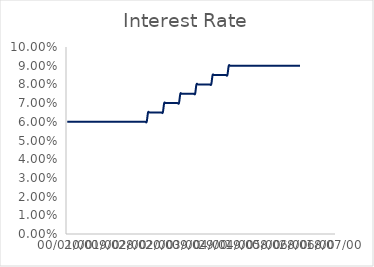
| Category | Interest Rate |
|---|---|
| 0 | 0.06 |
| 1 | 0.06 |
| 2 | 0.06 |
| 3 | 0.06 |
| 4 | 0.06 |
| 5 | 0.06 |
| 6 | 0.06 |
| 7 | 0.06 |
| 8 | 0.06 |
| 9 | 0.06 |
| 10 | 0.06 |
| 11 | 0.06 |
| 12 | 0.06 |
| 13 | 0.06 |
| 14 | 0.06 |
| 15 | 0.06 |
| 16 | 0.06 |
| 17 | 0.06 |
| 18 | 0.06 |
| 19 | 0.06 |
| 20 | 0.06 |
| 21 | 0.06 |
| 22 | 0.06 |
| 23 | 0.06 |
| 24 | 0.06 |
| 25 | 0.06 |
| 26 | 0.06 |
| 27 | 0.06 |
| 28 | 0.06 |
| 29 | 0.06 |
| 30 | 0.06 |
| 31 | 0.06 |
| 32 | 0.06 |
| 33 | 0.06 |
| 34 | 0.06 |
| 35 | 0.06 |
| 36 | 0.06 |
| 37 | 0.06 |
| 38 | 0.06 |
| 39 | 0.06 |
| 40 | 0.06 |
| 41 | 0.06 |
| 42 | 0.06 |
| 43 | 0.06 |
| 44 | 0.06 |
| 45 | 0.06 |
| 46 | 0.06 |
| 47 | 0.06 |
| 48 | 0.06 |
| 49 | 0.06 |
| 50 | 0.06 |
| 51 | 0.06 |
| 52 | 0.06 |
| 53 | 0.06 |
| 54 | 0.06 |
| 55 | 0.06 |
| 56 | 0.06 |
| 57 | 0.06 |
| 58 | 0.06 |
| 59 | 0.06 |
| 60 | 0.065 |
| 61 | 0.065 |
| 62 | 0.065 |
| 63 | 0.065 |
| 64 | 0.065 |
| 65 | 0.065 |
| 66 | 0.065 |
| 67 | 0.065 |
| 68 | 0.065 |
| 69 | 0.065 |
| 70 | 0.065 |
| 71 | 0.065 |
| 72 | 0.07 |
| 73 | 0.07 |
| 74 | 0.07 |
| 75 | 0.07 |
| 76 | 0.07 |
| 77 | 0.07 |
| 78 | 0.07 |
| 79 | 0.07 |
| 80 | 0.07 |
| 81 | 0.07 |
| 82 | 0.07 |
| 83 | 0.07 |
| 84 | 0.075 |
| 85 | 0.075 |
| 86 | 0.075 |
| 87 | 0.075 |
| 88 | 0.075 |
| 89 | 0.075 |
| 90 | 0.075 |
| 91 | 0.075 |
| 92 | 0.075 |
| 93 | 0.075 |
| 94 | 0.075 |
| 95 | 0.075 |
| 96 | 0.08 |
| 97 | 0.08 |
| 98 | 0.08 |
| 99 | 0.08 |
| 100 | 0.08 |
| 101 | 0.08 |
| 102 | 0.08 |
| 103 | 0.08 |
| 104 | 0.08 |
| 105 | 0.08 |
| 106 | 0.08 |
| 107 | 0.08 |
| 108 | 0.085 |
| 109 | 0.085 |
| 110 | 0.085 |
| 111 | 0.085 |
| 112 | 0.085 |
| 113 | 0.085 |
| 114 | 0.085 |
| 115 | 0.085 |
| 116 | 0.085 |
| 117 | 0.085 |
| 118 | 0.085 |
| 119 | 0.085 |
| 120 | 0.09 |
| 121 | 0.09 |
| 122 | 0.09 |
| 123 | 0.09 |
| 124 | 0.09 |
| 125 | 0.09 |
| 126 | 0.09 |
| 127 | 0.09 |
| 128 | 0.09 |
| 129 | 0.09 |
| 130 | 0.09 |
| 131 | 0.09 |
| 132 | 0.09 |
| 133 | 0.09 |
| 134 | 0.09 |
| 135 | 0.09 |
| 136 | 0.09 |
| 137 | 0.09 |
| 138 | 0.09 |
| 139 | 0.09 |
| 140 | 0.09 |
| 141 | 0.09 |
| 142 | 0.09 |
| 143 | 0.09 |
| 144 | 0.09 |
| 145 | 0.09 |
| 146 | 0.09 |
| 147 | 0.09 |
| 148 | 0.09 |
| 149 | 0.09 |
| 150 | 0.09 |
| 151 | 0.09 |
| 152 | 0.09 |
| 153 | 0.09 |
| 154 | 0.09 |
| 155 | 0.09 |
| 156 | 0.09 |
| 157 | 0.09 |
| 158 | 0.09 |
| 159 | 0.09 |
| 160 | 0.09 |
| 161 | 0.09 |
| 162 | 0.09 |
| 163 | 0.09 |
| 164 | 0.09 |
| 165 | 0.09 |
| 166 | 0.09 |
| 167 | 0.09 |
| 168 | 0.09 |
| 169 | 0.09 |
| 170 | 0.09 |
| 171 | 0.09 |
| 172 | 0.09 |
| 173 | 0.09 |
| 174 | 0 |
| 175 | 0 |
| 176 | 0 |
| 177 | 0 |
| 178 | 0 |
| 179 | 0 |
| 180 | 0 |
| 181 | 0 |
| 182 | 0 |
| 183 | 0 |
| 184 | 0 |
| 185 | 0 |
| 186 | 0 |
| 187 | 0 |
| 188 | 0 |
| 189 | 0 |
| 190 | 0 |
| 191 | 0 |
| 192 | 0 |
| 193 | 0 |
| 194 | 0 |
| 195 | 0 |
| 196 | 0 |
| 197 | 0 |
| 198 | 0 |
| 199 | 0 |
| 200 | 0 |
| 201 | 0 |
| 202 | 0 |
| 203 | 0 |
| 204 | 0 |
| 205 | 0 |
| 206 | 0 |
| 207 | 0 |
| 208 | 0 |
| 209 | 0 |
| 210 | 0 |
| 211 | 0 |
| 212 | 0 |
| 213 | 0 |
| 214 | 0 |
| 215 | 0 |
| 216 | 0 |
| 217 | 0 |
| 218 | 0 |
| 219 | 0 |
| 220 | 0 |
| 221 | 0 |
| 222 | 0 |
| 223 | 0 |
| 224 | 0 |
| 225 | 0 |
| 226 | 0 |
| 227 | 0 |
| 228 | 0 |
| 229 | 0 |
| 230 | 0 |
| 231 | 0 |
| 232 | 0 |
| 233 | 0 |
| 234 | 0 |
| 235 | 0 |
| 236 | 0 |
| 237 | 0 |
| 238 | 0 |
| 239 | 0 |
| 240 | 0 |
| 241 | 0 |
| 242 | 0 |
| 243 | 0 |
| 244 | 0 |
| 245 | 0 |
| 246 | 0 |
| 247 | 0 |
| 248 | 0 |
| 249 | 0 |
| 250 | 0 |
| 251 | 0 |
| 252 | 0 |
| 253 | 0 |
| 254 | 0 |
| 255 | 0 |
| 256 | 0 |
| 257 | 0 |
| 258 | 0 |
| 259 | 0 |
| 260 | 0 |
| 261 | 0 |
| 262 | 0 |
| 263 | 0 |
| 264 | 0 |
| 265 | 0 |
| 266 | 0 |
| 267 | 0 |
| 268 | 0 |
| 269 | 0 |
| 270 | 0 |
| 271 | 0 |
| 272 | 0 |
| 273 | 0 |
| 274 | 0 |
| 275 | 0 |
| 276 | 0 |
| 277 | 0 |
| 278 | 0 |
| 279 | 0 |
| 280 | 0 |
| 281 | 0 |
| 282 | 0 |
| 283 | 0 |
| 284 | 0 |
| 285 | 0 |
| 286 | 0 |
| 287 | 0 |
| 288 | 0 |
| 289 | 0 |
| 290 | 0 |
| 291 | 0 |
| 292 | 0 |
| 293 | 0 |
| 294 | 0 |
| 295 | 0 |
| 296 | 0 |
| 297 | 0 |
| 298 | 0 |
| 299 | 0 |
| 300 | 0 |
| 301 | 0 |
| 302 | 0 |
| 303 | 0 |
| 304 | 0 |
| 305 | 0 |
| 306 | 0 |
| 307 | 0 |
| 308 | 0 |
| 309 | 0 |
| 310 | 0 |
| 311 | 0 |
| 312 | 0 |
| 313 | 0 |
| 314 | 0 |
| 315 | 0 |
| 316 | 0 |
| 317 | 0 |
| 318 | 0 |
| 319 | 0 |
| 320 | 0 |
| 321 | 0 |
| 322 | 0 |
| 323 | 0 |
| 324 | 0 |
| 325 | 0 |
| 326 | 0 |
| 327 | 0 |
| 328 | 0 |
| 329 | 0 |
| 330 | 0 |
| 331 | 0 |
| 332 | 0 |
| 333 | 0 |
| 334 | 0 |
| 335 | 0 |
| 336 | 0 |
| 337 | 0 |
| 338 | 0 |
| 339 | 0 |
| 340 | 0 |
| 341 | 0 |
| 342 | 0 |
| 343 | 0 |
| 344 | 0 |
| 345 | 0 |
| 346 | 0 |
| 347 | 0 |
| 348 | 0 |
| 349 | 0 |
| 350 | 0 |
| 351 | 0 |
| 352 | 0 |
| 353 | 0 |
| 354 | 0 |
| 355 | 0 |
| 356 | 0 |
| 357 | 0 |
| 358 | 0 |
| 359 | 0 |
| 360 | 0 |
| 361 | 0 |
| 362 | 0 |
| 363 | 0 |
| 364 | 0 |
| 365 | 0 |
| 366 | 0 |
| 367 | 0 |
| 368 | 0 |
| 369 | 0 |
| 370 | 0 |
| 371 | 0 |
| 372 | 0 |
| 373 | 0 |
| 374 | 0 |
| 375 | 0 |
| 376 | 0 |
| 377 | 0 |
| 378 | 0 |
| 379 | 0 |
| 380 | 0 |
| 381 | 0 |
| 382 | 0 |
| 383 | 0 |
| 384 | 0 |
| 385 | 0 |
| 386 | 0 |
| 387 | 0 |
| 388 | 0 |
| 389 | 0 |
| 390 | 0 |
| 391 | 0 |
| 392 | 0 |
| 393 | 0 |
| 394 | 0 |
| 395 | 0 |
| 396 | 0 |
| 397 | 0 |
| 398 | 0 |
| 399 | 0 |
| 400 | 0 |
| 401 | 0 |
| 402 | 0 |
| 403 | 0 |
| 404 | 0 |
| 405 | 0 |
| 406 | 0 |
| 407 | 0 |
| 408 | 0 |
| 409 | 0 |
| 410 | 0 |
| 411 | 0 |
| 412 | 0 |
| 413 | 0 |
| 414 | 0 |
| 415 | 0 |
| 416 | 0 |
| 417 | 0 |
| 418 | 0 |
| 419 | 0 |
| 420 | 0 |
| 421 | 0 |
| 422 | 0 |
| 423 | 0 |
| 424 | 0 |
| 425 | 0 |
| 426 | 0 |
| 427 | 0 |
| 428 | 0 |
| 429 | 0 |
| 430 | 0 |
| 431 | 0 |
| 432 | 0 |
| 433 | 0 |
| 434 | 0 |
| 435 | 0 |
| 436 | 0 |
| 437 | 0 |
| 438 | 0 |
| 439 | 0 |
| 440 | 0 |
| 441 | 0 |
| 442 | 0 |
| 443 | 0 |
| 444 | 0 |
| 445 | 0 |
| 446 | 0 |
| 447 | 0 |
| 448 | 0 |
| 449 | 0 |
| 450 | 0 |
| 451 | 0 |
| 452 | 0 |
| 453 | 0 |
| 454 | 0 |
| 455 | 0 |
| 456 | 0 |
| 457 | 0 |
| 458 | 0 |
| 459 | 0 |
| 460 | 0 |
| 461 | 0 |
| 462 | 0 |
| 463 | 0 |
| 464 | 0 |
| 465 | 0 |
| 466 | 0 |
| 467 | 0 |
| 468 | 0 |
| 469 | 0 |
| 470 | 0 |
| 471 | 0 |
| 472 | 0 |
| 473 | 0 |
| 474 | 0 |
| 475 | 0 |
| 476 | 0 |
| 477 | 0 |
| 478 | 0 |
| 479 | 0 |
| 480 | 0 |
| 481 | 0 |
| 482 | 0 |
| 483 | 0 |
| 484 | 0 |
| 485 | 0 |
| 486 | 0 |
| 487 | 0 |
| 488 | 0 |
| 489 | 0 |
| 490 | 0 |
| 491 | 0 |
| 492 | 0 |
| 493 | 0 |
| 494 | 0 |
| 495 | 0 |
| 496 | 0 |
| 497 | 0 |
| 498 | 0 |
| 499 | 0 |
| 500 | 0 |
| 501 | 0 |
| 502 | 0 |
| 503 | 0 |
| 504 | 0 |
| 505 | 0 |
| 506 | 0 |
| 507 | 0 |
| 508 | 0 |
| 509 | 0 |
| 510 | 0 |
| 511 | 0 |
| 512 | 0 |
| 513 | 0 |
| 514 | 0 |
| 515 | 0 |
| 516 | 0 |
| 517 | 0 |
| 518 | 0 |
| 519 | 0 |
| 520 | 0 |
| 521 | 0 |
| 522 | 0 |
| 523 | 0 |
| 524 | 0 |
| 525 | 0 |
| 526 | 0 |
| 527 | 0 |
| 528 | 0 |
| 529 | 0 |
| 530 | 0 |
| 531 | 0 |
| 532 | 0 |
| 533 | 0 |
| 534 | 0 |
| 535 | 0 |
| 536 | 0 |
| 537 | 0 |
| 538 | 0 |
| 539 | 0 |
| 540 | 0 |
| 541 | 0 |
| 542 | 0 |
| 543 | 0 |
| 544 | 0 |
| 545 | 0 |
| 546 | 0 |
| 547 | 0 |
| 548 | 0 |
| 549 | 0 |
| 550 | 0 |
| 551 | 0 |
| 552 | 0 |
| 553 | 0 |
| 554 | 0 |
| 555 | 0 |
| 556 | 0 |
| 557 | 0 |
| 558 | 0 |
| 559 | 0 |
| 560 | 0 |
| 561 | 0 |
| 562 | 0 |
| 563 | 0 |
| 564 | 0 |
| 565 | 0 |
| 566 | 0 |
| 567 | 0 |
| 568 | 0 |
| 569 | 0 |
| 570 | 0 |
| 571 | 0 |
| 572 | 0 |
| 573 | 0 |
| 574 | 0 |
| 575 | 0 |
| 576 | 0 |
| 577 | 0 |
| 578 | 0 |
| 579 | 0 |
| 580 | 0 |
| 581 | 0 |
| 582 | 0 |
| 583 | 0 |
| 584 | 0 |
| 585 | 0 |
| 586 | 0 |
| 587 | 0 |
| 588 | 0 |
| 589 | 0 |
| 590 | 0 |
| 591 | 0 |
| 592 | 0 |
| 593 | 0 |
| 594 | 0 |
| 595 | 0 |
| 596 | 0 |
| 597 | 0 |
| 598 | 0 |
| 599 | 0 |
| 600 | 0 |
| 601 | 0 |
| 602 | 0 |
| 603 | 0 |
| 604 | 0 |
| 605 | 0 |
| 606 | 0 |
| 607 | 0 |
| 608 | 0 |
| 609 | 0 |
| 610 | 0 |
| 611 | 0 |
| 612 | 0 |
| 613 | 0 |
| 614 | 0 |
| 615 | 0 |
| 616 | 0 |
| 617 | 0 |
| 618 | 0 |
| 619 | 0 |
| 620 | 0 |
| 621 | 0 |
| 622 | 0 |
| 623 | 0 |
| 624 | 0 |
| 625 | 0 |
| 626 | 0 |
| 627 | 0 |
| 628 | 0 |
| 629 | 0 |
| 630 | 0 |
| 631 | 0 |
| 632 | 0 |
| 633 | 0 |
| 634 | 0 |
| 635 | 0 |
| 636 | 0 |
| 637 | 0 |
| 638 | 0 |
| 639 | 0 |
| 640 | 0 |
| 641 | 0 |
| 642 | 0 |
| 643 | 0 |
| 644 | 0 |
| 645 | 0 |
| 646 | 0 |
| 647 | 0 |
| 648 | 0 |
| 649 | 0 |
| 650 | 0 |
| 651 | 0 |
| 652 | 0 |
| 653 | 0 |
| 654 | 0 |
| 655 | 0 |
| 656 | 0 |
| 657 | 0 |
| 658 | 0 |
| 659 | 0 |
| 660 | 0 |
| 661 | 0 |
| 662 | 0 |
| 663 | 0 |
| 664 | 0 |
| 665 | 0 |
| 666 | 0 |
| 667 | 0 |
| 668 | 0 |
| 669 | 0 |
| 670 | 0 |
| 671 | 0 |
| 672 | 0 |
| 673 | 0 |
| 674 | 0 |
| 675 | 0 |
| 676 | 0 |
| 677 | 0 |
| 678 | 0 |
| 679 | 0 |
| 680 | 0 |
| 681 | 0 |
| 682 | 0 |
| 683 | 0 |
| 684 | 0 |
| 685 | 0 |
| 686 | 0 |
| 687 | 0 |
| 688 | 0 |
| 689 | 0 |
| 690 | 0 |
| 691 | 0 |
| 692 | 0 |
| 693 | 0 |
| 694 | 0 |
| 695 | 0 |
| 696 | 0 |
| 697 | 0 |
| 698 | 0 |
| 699 | 0 |
| 700 | 0 |
| 701 | 0 |
| 702 | 0 |
| 703 | 0 |
| 704 | 0 |
| 705 | 0 |
| 706 | 0 |
| 707 | 0 |
| 708 | 0 |
| 709 | 0 |
| 710 | 0 |
| 711 | 0 |
| 712 | 0 |
| 713 | 0 |
| 714 | 0 |
| 715 | 0 |
| 716 | 0 |
| 717 | 0 |
| 718 | 0 |
| 719 | 0 |
| 720 | 0 |
| 721 | 0 |
| 722 | 0 |
| 723 | 0 |
| 724 | 0 |
| 725 | 0 |
| 726 | 0 |
| 727 | 0 |
| 728 | 0 |
| 729 | 0 |
| 730 | 0 |
| 731 | 0 |
| 732 | 0 |
| 733 | 0 |
| 734 | 0 |
| 735 | 0 |
| 736 | 0 |
| 737 | 0 |
| 738 | 0 |
| 739 | 0 |
| 740 | 0 |
| 741 | 0 |
| 742 | 0 |
| 743 | 0 |
| 744 | 0 |
| 745 | 0 |
| 746 | 0 |
| 747 | 0 |
| 748 | 0 |
| 749 | 0 |
| 750 | 0 |
| 751 | 0 |
| 752 | 0 |
| 753 | 0 |
| 754 | 0 |
| 755 | 0 |
| 756 | 0 |
| 757 | 0 |
| 758 | 0 |
| 759 | 0 |
| 760 | 0 |
| 761 | 0 |
| 762 | 0 |
| 763 | 0 |
| 764 | 0 |
| 765 | 0 |
| 766 | 0 |
| 767 | 0 |
| 768 | 0 |
| 769 | 0 |
| 770 | 0 |
| 771 | 0 |
| 772 | 0 |
| 773 | 0 |
| 774 | 0 |
| 775 | 0 |
| 776 | 0 |
| 777 | 0 |
| 778 | 0 |
| 779 | 0 |
| 780 | 0 |
| 781 | 0 |
| 782 | 0 |
| 783 | 0 |
| 784 | 0 |
| 785 | 0 |
| 786 | 0 |
| 787 | 0 |
| 788 | 0 |
| 789 | 0 |
| 790 | 0 |
| 791 | 0 |
| 792 | 0 |
| 793 | 0 |
| 794 | 0 |
| 795 | 0 |
| 796 | 0 |
| 797 | 0 |
| 798 | 0 |
| 799 | 0 |
| 800 | 0 |
| 801 | 0 |
| 802 | 0 |
| 803 | 0 |
| 804 | 0 |
| 805 | 0 |
| 806 | 0 |
| 807 | 0 |
| 808 | 0 |
| 809 | 0 |
| 810 | 0 |
| 811 | 0 |
| 812 | 0 |
| 813 | 0 |
| 814 | 0 |
| 815 | 0 |
| 816 | 0 |
| 817 | 0 |
| 818 | 0 |
| 819 | 0 |
| 820 | 0 |
| 821 | 0 |
| 822 | 0 |
| 823 | 0 |
| 824 | 0 |
| 825 | 0 |
| 826 | 0 |
| 827 | 0 |
| 828 | 0 |
| 829 | 0 |
| 830 | 0 |
| 831 | 0 |
| 832 | 0 |
| 833 | 0 |
| 834 | 0 |
| 835 | 0 |
| 836 | 0 |
| 837 | 0 |
| 838 | 0 |
| 839 | 0 |
| 840 | 0 |
| 841 | 0 |
| 842 | 0 |
| 843 | 0 |
| 844 | 0 |
| 845 | 0 |
| 846 | 0 |
| 847 | 0 |
| 848 | 0 |
| 849 | 0 |
| 850 | 0 |
| 851 | 0 |
| 852 | 0 |
| 853 | 0 |
| 854 | 0 |
| 855 | 0 |
| 856 | 0 |
| 857 | 0 |
| 858 | 0 |
| 859 | 0 |
| 860 | 0 |
| 861 | 0 |
| 862 | 0 |
| 863 | 0 |
| 864 | 0 |
| 865 | 0 |
| 866 | 0 |
| 867 | 0 |
| 868 | 0 |
| 869 | 0 |
| 870 | 0 |
| 871 | 0 |
| 872 | 0 |
| 873 | 0 |
| 874 | 0 |
| 875 | 0 |
| 876 | 0 |
| 877 | 0 |
| 878 | 0 |
| 879 | 0 |
| 880 | 0 |
| 881 | 0 |
| 882 | 0 |
| 883 | 0 |
| 884 | 0 |
| 885 | 0 |
| 886 | 0 |
| 887 | 0 |
| 888 | 0 |
| 889 | 0 |
| 890 | 0 |
| 891 | 0 |
| 892 | 0 |
| 893 | 0 |
| 894 | 0 |
| 895 | 0 |
| 896 | 0 |
| 897 | 0 |
| 898 | 0 |
| 899 | 0 |
| 900 | 0 |
| 901 | 0 |
| 902 | 0 |
| 903 | 0 |
| 904 | 0 |
| 905 | 0 |
| 906 | 0 |
| 907 | 0 |
| 908 | 0 |
| 909 | 0 |
| 910 | 0 |
| 911 | 0 |
| 912 | 0 |
| 913 | 0 |
| 914 | 0 |
| 915 | 0 |
| 916 | 0 |
| 917 | 0 |
| 918 | 0 |
| 919 | 0 |
| 920 | 0 |
| 921 | 0 |
| 922 | 0 |
| 923 | 0 |
| 924 | 0 |
| 925 | 0 |
| 926 | 0 |
| 927 | 0 |
| 928 | 0 |
| 929 | 0 |
| 930 | 0 |
| 931 | 0 |
| 932 | 0 |
| 933 | 0 |
| 934 | 0 |
| 935 | 0 |
| 936 | 0 |
| 937 | 0 |
| 938 | 0 |
| 939 | 0 |
| 940 | 0 |
| 941 | 0 |
| 942 | 0 |
| 943 | 0 |
| 944 | 0 |
| 945 | 0 |
| 946 | 0 |
| 947 | 0 |
| 948 | 0 |
| 949 | 0 |
| 950 | 0 |
| 951 | 0 |
| 952 | 0 |
| 953 | 0 |
| 954 | 0 |
| 955 | 0 |
| 956 | 0 |
| 957 | 0 |
| 958 | 0 |
| 959 | 0 |
| 960 | 0 |
| 961 | 0 |
| 962 | 0 |
| 963 | 0 |
| 964 | 0 |
| 965 | 0 |
| 966 | 0 |
| 967 | 0 |
| 968 | 0 |
| 969 | 0 |
| 970 | 0 |
| 971 | 0 |
| 972 | 0 |
| 973 | 0 |
| 974 | 0 |
| 975 | 0 |
| 976 | 0 |
| 977 | 0 |
| 978 | 0 |
| 979 | 0 |
| 980 | 0 |
| 981 | 0 |
| 982 | 0 |
| 983 | 0 |
| 984 | 0 |
| 985 | 0 |
| 986 | 0 |
| 987 | 0 |
| 988 | 0 |
| 989 | 0 |
| 990 | 0 |
| 991 | 0 |
| 992 | 0 |
| 993 | 0 |
| 994 | 0 |
| 995 | 0 |
| 996 | 0 |
| 997 | 0 |
| 998 | 0 |
| 999 | 0 |
| 1000 | 0 |
| 1001 | 0 |
| 1002 | 0 |
| 1003 | 0 |
| 1004 | 0 |
| 1005 | 0 |
| 1006 | 0 |
| 1007 | 0 |
| 1008 | 0 |
| 1009 | 0 |
| 1010 | 0 |
| 1011 | 0 |
| 1012 | 0 |
| 1013 | 0 |
| 1014 | 0 |
| 1015 | 0 |
| 1016 | 0 |
| 1017 | 0 |
| 1018 | 0 |
| 1019 | 0 |
| 1020 | 0 |
| 1021 | 0 |
| 1022 | 0 |
| 1023 | 0 |
| 1024 | 0 |
| 1025 | 0 |
| 1026 | 0 |
| 1027 | 0 |
| 1028 | 0 |
| 1029 | 0 |
| 1030 | 0 |
| 1031 | 0 |
| 1032 | 0 |
| 1033 | 0 |
| 1034 | 0 |
| 1035 | 0 |
| 1036 | 0 |
| 1037 | 0 |
| 1038 | 0 |
| 1039 | 0 |
| 1040 | 0 |
| 1041 | 0 |
| 1042 | 0 |
| 1043 | 0 |
| 1044 | 0 |
| 1045 | 0 |
| 1046 | 0 |
| 1047 | 0 |
| 1048 | 0 |
| 1049 | 0 |
| 1050 | 0 |
| 1051 | 0 |
| 1052 | 0 |
| 1053 | 0 |
| 1054 | 0 |
| 1055 | 0 |
| 1056 | 0 |
| 1057 | 0 |
| 1058 | 0 |
| 1059 | 0 |
| 1060 | 0 |
| 1061 | 0 |
| 1062 | 0 |
| 1063 | 0 |
| 1064 | 0 |
| 1065 | 0 |
| 1066 | 0 |
| 1067 | 0 |
| 1068 | 0 |
| 1069 | 0 |
| 1070 | 0 |
| 1071 | 0 |
| 1072 | 0 |
| 1073 | 0 |
| 1074 | 0 |
| 1075 | 0 |
| 1076 | 0 |
| 1077 | 0 |
| 1078 | 0 |
| 1079 | 0 |
| 1080 | 0 |
| 1081 | 0 |
| 1082 | 0 |
| 1083 | 0 |
| 1084 | 0 |
| 1085 | 0 |
| 1086 | 0 |
| 1087 | 0 |
| 1088 | 0 |
| 1089 | 0 |
| 1090 | 0 |
| 1091 | 0 |
| 1092 | 0 |
| 1093 | 0 |
| 1094 | 0 |
| 1095 | 0 |
| 1096 | 0 |
| 1097 | 0 |
| 1098 | 0 |
| 1099 | 0 |
| 1100 | 0 |
| 1101 | 0 |
| 1102 | 0 |
| 1103 | 0 |
| 1104 | 0 |
| 1105 | 0 |
| 1106 | 0 |
| 1107 | 0 |
| 1108 | 0 |
| 1109 | 0 |
| 1110 | 0 |
| 1111 | 0 |
| 1112 | 0 |
| 1113 | 0 |
| 1114 | 0 |
| 1115 | 0 |
| 1116 | 0 |
| 1117 | 0 |
| 1118 | 0 |
| 1119 | 0 |
| 1120 | 0 |
| 1121 | 0 |
| 1122 | 0 |
| 1123 | 0 |
| 1124 | 0 |
| 1125 | 0 |
| 1126 | 0 |
| 1127 | 0 |
| 1128 | 0 |
| 1129 | 0 |
| 1130 | 0 |
| 1131 | 0 |
| 1132 | 0 |
| 1133 | 0 |
| 1134 | 0 |
| 1135 | 0 |
| 1136 | 0 |
| 1137 | 0 |
| 1138 | 0 |
| 1139 | 0 |
| 1140 | 0 |
| 1141 | 0 |
| 1142 | 0 |
| 1143 | 0 |
| 1144 | 0 |
| 1145 | 0 |
| 1146 | 0 |
| 1147 | 0 |
| 1148 | 0 |
| 1149 | 0 |
| 1150 | 0 |
| 1151 | 0 |
| 1152 | 0 |
| 1153 | 0 |
| 1154 | 0 |
| 1155 | 0 |
| 1156 | 0 |
| 1157 | 0 |
| 1158 | 0 |
| 1159 | 0 |
| 1160 | 0 |
| 1161 | 0 |
| 1162 | 0 |
| 1163 | 0 |
| 1164 | 0 |
| 1165 | 0 |
| 1166 | 0 |
| 1167 | 0 |
| 1168 | 0 |
| 1169 | 0 |
| 1170 | 0 |
| 1171 | 0 |
| 1172 | 0 |
| 1173 | 0 |
| 1174 | 0 |
| 1175 | 0 |
| 1176 | 0 |
| 1177 | 0 |
| 1178 | 0 |
| 1179 | 0 |
| 1180 | 0 |
| 1181 | 0 |
| 1182 | 0 |
| 1183 | 0 |
| 1184 | 0 |
| 1185 | 0 |
| 1186 | 0 |
| 1187 | 0 |
| 1188 | 0 |
| 1189 | 0 |
| 1190 | 0 |
| 1191 | 0 |
| 1192 | 0 |
| 1193 | 0 |
| 1194 | 0 |
| 1195 | 0 |
| 1196 | 0 |
| 1197 | 0 |
| 1198 | 0 |
| 1199 | 0 |
| 1200 | 0 |
| 1201 | 0 |
| 1202 | 0 |
| 1203 | 0 |
| 1204 | 0 |
| 1205 | 0 |
| 1206 | 0 |
| 1207 | 0 |
| 1208 | 0 |
| 1209 | 0 |
| 1210 | 0 |
| 1211 | 0 |
| 1212 | 0 |
| 1213 | 0 |
| 1214 | 0 |
| 1215 | 0 |
| 1216 | 0 |
| 1217 | 0 |
| 1218 | 0 |
| 1219 | 0 |
| 1220 | 0 |
| 1221 | 0 |
| 1222 | 0 |
| 1223 | 0 |
| 1224 | 0 |
| 1225 | 0 |
| 1226 | 0 |
| 1227 | 0 |
| 1228 | 0 |
| 1229 | 0 |
| 1230 | 0 |
| 1231 | 0 |
| 1232 | 0 |
| 1233 | 0 |
| 1234 | 0 |
| 1235 | 0 |
| 1236 | 0 |
| 1237 | 0 |
| 1238 | 0 |
| 1239 | 0 |
| 1240 | 0 |
| 1241 | 0 |
| 1242 | 0 |
| 1243 | 0 |
| 1244 | 0 |
| 1245 | 0 |
| 1246 | 0 |
| 1247 | 0 |
| 1248 | 0 |
| 1249 | 0 |
| 1250 | 0 |
| 1251 | 0 |
| 1252 | 0 |
| 1253 | 0 |
| 1254 | 0 |
| 1255 | 0 |
| 1256 | 0 |
| 1257 | 0 |
| 1258 | 0 |
| 1259 | 0 |
| 1260 | 0 |
| 1261 | 0 |
| 1262 | 0 |
| 1263 | 0 |
| 1264 | 0 |
| 1265 | 0 |
| 1266 | 0 |
| 1267 | 0 |
| 1268 | 0 |
| 1269 | 0 |
| 1270 | 0 |
| 1271 | 0 |
| 1272 | 0 |
| 1273 | 0 |
| 1274 | 0 |
| 1275 | 0 |
| 1276 | 0 |
| 1277 | 0 |
| 1278 | 0 |
| 1279 | 0 |
| 1280 | 0 |
| 1281 | 0 |
| 1282 | 0 |
| 1283 | 0 |
| 1284 | 0 |
| 1285 | 0 |
| 1286 | 0 |
| 1287 | 0 |
| 1288 | 0 |
| 1289 | 0 |
| 1290 | 0 |
| 1291 | 0 |
| 1292 | 0 |
| 1293 | 0 |
| 1294 | 0 |
| 1295 | 0 |
| 1296 | 0 |
| 1297 | 0 |
| 1298 | 0 |
| 1299 | 0 |
| 1300 | 0 |
| 1301 | 0 |
| 1302 | 0 |
| 1303 | 0 |
| 1304 | 0 |
| 1305 | 0 |
| 1306 | 0 |
| 1307 | 0 |
| 1308 | 0 |
| 1309 | 0 |
| 1310 | 0 |
| 1311 | 0 |
| 1312 | 0 |
| 1313 | 0 |
| 1314 | 0 |
| 1315 | 0 |
| 1316 | 0 |
| 1317 | 0 |
| 1318 | 0 |
| 1319 | 0 |
| 1320 | 0 |
| 1321 | 0 |
| 1322 | 0 |
| 1323 | 0 |
| 1324 | 0 |
| 1325 | 0 |
| 1326 | 0 |
| 1327 | 0 |
| 1328 | 0 |
| 1329 | 0 |
| 1330 | 0 |
| 1331 | 0 |
| 1332 | 0 |
| 1333 | 0 |
| 1334 | 0 |
| 1335 | 0 |
| 1336 | 0 |
| 1337 | 0 |
| 1338 | 0 |
| 1339 | 0 |
| 1340 | 0 |
| 1341 | 0 |
| 1342 | 0 |
| 1343 | 0 |
| 1344 | 0 |
| 1345 | 0 |
| 1346 | 0 |
| 1347 | 0 |
| 1348 | 0 |
| 1349 | 0 |
| 1350 | 0 |
| 1351 | 0 |
| 1352 | 0 |
| 1353 | 0 |
| 1354 | 0 |
| 1355 | 0 |
| 1356 | 0 |
| 1357 | 0 |
| 1358 | 0 |
| 1359 | 0 |
| 1360 | 0 |
| 1361 | 0 |
| 1362 | 0 |
| 1363 | 0 |
| 1364 | 0 |
| 1365 | 0 |
| 1366 | 0 |
| 1367 | 0 |
| 1368 | 0 |
| 1369 | 0 |
| 1370 | 0 |
| 1371 | 0 |
| 1372 | 0 |
| 1373 | 0 |
| 1374 | 0 |
| 1375 | 0 |
| 1376 | 0 |
| 1377 | 0 |
| 1378 | 0 |
| 1379 | 0 |
| 1380 | 0 |
| 1381 | 0 |
| 1382 | 0 |
| 1383 | 0 |
| 1384 | 0 |
| 1385 | 0 |
| 1386 | 0 |
| 1387 | 0 |
| 1388 | 0 |
| 1389 | 0 |
| 1390 | 0 |
| 1391 | 0 |
| 1392 | 0 |
| 1393 | 0 |
| 1394 | 0 |
| 1395 | 0 |
| 1396 | 0 |
| 1397 | 0 |
| 1398 | 0 |
| 1399 | 0 |
| 1400 | 0 |
| 1401 | 0 |
| 1402 | 0 |
| 1403 | 0 |
| 1404 | 0 |
| 1405 | 0 |
| 1406 | 0 |
| 1407 | 0 |
| 1408 | 0 |
| 1409 | 0 |
| 1410 | 0 |
| 1411 | 0 |
| 1412 | 0 |
| 1413 | 0 |
| 1414 | 0 |
| 1415 | 0 |
| 1416 | 0 |
| 1417 | 0 |
| 1418 | 0 |
| 1419 | 0 |
| 1420 | 0 |
| 1421 | 0 |
| 1422 | 0 |
| 1423 | 0 |
| 1424 | 0 |
| 1425 | 0 |
| 1426 | 0 |
| 1427 | 0 |
| 1428 | 0 |
| 1429 | 0 |
| 1430 | 0 |
| 1431 | 0 |
| 1432 | 0 |
| 1433 | 0 |
| 1434 | 0 |
| 1435 | 0 |
| 1436 | 0 |
| 1437 | 0 |
| 1438 | 0 |
| 1439 | 0 |
| 1440 | 0 |
| 1441 | 0 |
| 1442 | 0 |
| 1443 | 0 |
| 1444 | 0 |
| 1445 | 0 |
| 1446 | 0 |
| 1447 | 0 |
| 1448 | 0 |
| 1449 | 0 |
| 1450 | 0 |
| 1451 | 0 |
| 1452 | 0 |
| 1453 | 0 |
| 1454 | 0 |
| 1455 | 0 |
| 1456 | 0 |
| 1457 | 0 |
| 1458 | 0 |
| 1459 | 0 |
| 1460 | 0 |
| 1461 | 0 |
| 1462 | 0 |
| 1463 | 0 |
| 1464 | 0 |
| 1465 | 0 |
| 1466 | 0 |
| 1467 | 0 |
| 1468 | 0 |
| 1469 | 0 |
| 1470 | 0 |
| 1471 | 0 |
| 1472 | 0 |
| 1473 | 0 |
| 1474 | 0 |
| 1475 | 0 |
| 1476 | 0 |
| 1477 | 0 |
| 1478 | 0 |
| 1479 | 0 |
| 1480 | 0 |
| 1481 | 0 |
| 1482 | 0 |
| 1483 | 0 |
| 1484 | 0 |
| 1485 | 0 |
| 1486 | 0 |
| 1487 | 0 |
| 1488 | 0 |
| 1489 | 0 |
| 1490 | 0 |
| 1491 | 0 |
| 1492 | 0 |
| 1493 | 0 |
| 1494 | 0 |
| 1495 | 0 |
| 1496 | 0 |
| 1497 | 0 |
| 1498 | 0 |
| 1499 | 0 |
| 1500 | 0 |
| 1501 | 0 |
| 1502 | 0 |
| 1503 | 0 |
| 1504 | 0 |
| 1505 | 0 |
| 1506 | 0 |
| 1507 | 0 |
| 1508 | 0 |
| 1509 | 0 |
| 1510 | 0 |
| 1511 | 0 |
| 1512 | 0 |
| 1513 | 0 |
| 1514 | 0 |
| 1515 | 0 |
| 1516 | 0 |
| 1517 | 0 |
| 1518 | 0 |
| 1519 | 0 |
| 1520 | 0 |
| 1521 | 0 |
| 1522 | 0 |
| 1523 | 0 |
| 1524 | 0 |
| 1525 | 0 |
| 1526 | 0 |
| 1527 | 0 |
| 1528 | 0 |
| 1529 | 0 |
| 1530 | 0 |
| 1531 | 0 |
| 1532 | 0 |
| 1533 | 0 |
| 1534 | 0 |
| 1535 | 0 |
| 1536 | 0 |
| 1537 | 0 |
| 1538 | 0 |
| 1539 | 0 |
| 1540 | 0 |
| 1541 | 0 |
| 1542 | 0 |
| 1543 | 0 |
| 1544 | 0 |
| 1545 | 0 |
| 1546 | 0 |
| 1547 | 0 |
| 1548 | 0 |
| 1549 | 0 |
| 1550 | 0 |
| 1551 | 0 |
| 1552 | 0 |
| 1553 | 0 |
| 1554 | 0 |
| 1555 | 0 |
| 1556 | 0 |
| 1557 | 0 |
| 1558 | 0 |
| 1559 | 0 |
| 1560 | 0 |
| 1561 | 0 |
| 1562 | 0 |
| 1563 | 0 |
| 1564 | 0 |
| 1565 | 0 |
| 1566 | 0 |
| 1567 | 0 |
| 1568 | 0 |
| 1569 | 0 |
| 1570 | 0 |
| 1571 | 0 |
| 1572 | 0 |
| 1573 | 0 |
| 1574 | 0 |
| 1575 | 0 |
| 1576 | 0 |
| 1577 | 0 |
| 1578 | 0 |
| 1579 | 0 |
| 1580 | 0 |
| 1581 | 0 |
| 1582 | 0 |
| 1583 | 0 |
| 1584 | 0 |
| 1585 | 0 |
| 1586 | 0 |
| 1587 | 0 |
| 1588 | 0 |
| 1589 | 0 |
| 1590 | 0 |
| 1591 | 0 |
| 1592 | 0 |
| 1593 | 0 |
| 1594 | 0 |
| 1595 | 0 |
| 1596 | 0 |
| 1597 | 0 |
| 1598 | 0 |
| 1599 | 0 |
| 1600 | 0 |
| 1601 | 0 |
| 1602 | 0 |
| 1603 | 0 |
| 1604 | 0 |
| 1605 | 0 |
| 1606 | 0 |
| 1607 | 0 |
| 1608 | 0 |
| 1609 | 0 |
| 1610 | 0 |
| 1611 | 0 |
| 1612 | 0 |
| 1613 | 0 |
| 1614 | 0 |
| 1615 | 0 |
| 1616 | 0 |
| 1617 | 0 |
| 1618 | 0 |
| 1619 | 0 |
| 1620 | 0 |
| 1621 | 0 |
| 1622 | 0 |
| 1623 | 0 |